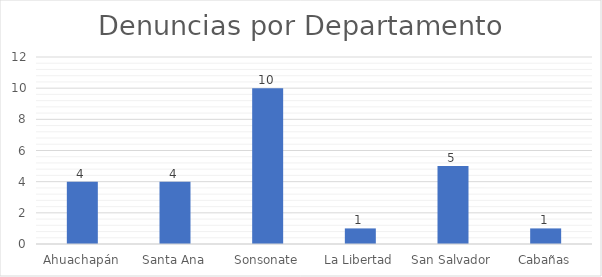
| Category | Series 0 |
|---|---|
| Ahuachapán | 4 |
| Santa Ana | 4 |
| Sonsonate | 10 |
| La Libertad | 1 |
| San Salvador | 5 |
| Cabañas | 1 |